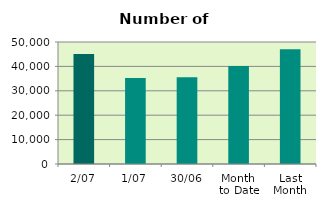
| Category | Series 0 |
|---|---|
| 2/07 | 45066 |
| 1/07 | 35284 |
| 30/06 | 35560 |
| Month 
to Date | 40175 |
| Last
Month | 46980.273 |